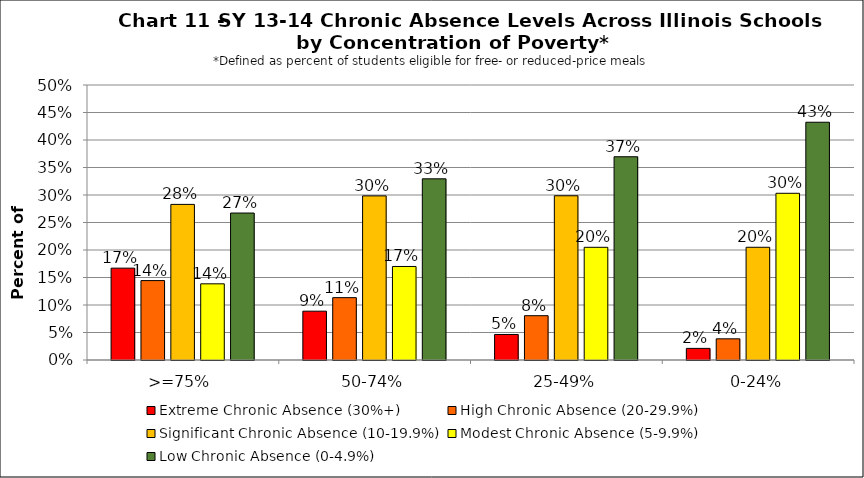
| Category | Extreme Chronic Absence (30%+) | High Chronic Absence (20-29.9%) | Significant Chronic Absence (10-19.9%) | Modest Chronic Absence (5-9.9%) | Low Chronic Absence (0-4.9%) |
|---|---|---|---|---|---|
| 0 | 0.167 | 0.144 | 0.283 | 0.139 | 0.267 |
| 1 | 0.089 | 0.113 | 0.298 | 0.17 | 0.329 |
| 2 | 0.046 | 0.081 | 0.299 | 0.205 | 0.37 |
| 3 | 0.021 | 0.039 | 0.205 | 0.303 | 0.432 |